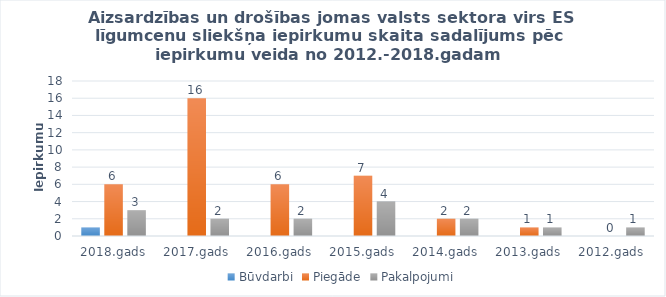
| Category | Būvdarbi | Piegāde | Pakalpojumi |
|---|---|---|---|
| 2018.gads | 1 | 6 | 3 |
| 2017.gads | 0 | 16 | 2 |
| 2016.gads | 0 | 6 | 2 |
| 2015.gads | 0 | 7 | 4 |
| 2014.gads | 0 | 2 | 2 |
| 2013.gads | 0 | 1 | 1 |
| 2012.gads | 0 | 0 | 1 |